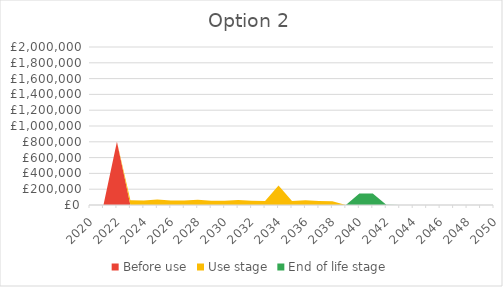
| Category | Before use | Use stage | End of life stage |
|---|---|---|---|
| 2020 | 0 | 0 | 0 |
| 2021 | 0 | 0 | 0 |
| 2022 | 801845.099 | 0 | 0 |
| 2023 | 0 | 59339.58 | 0 |
| 2024 | 0 | 58299.302 | 0 |
| 2025 | 0 | 68673.941 | 0 |
| 2026 | 0 | 56890.675 | 0 |
| 2027 | 0 | 56125.029 | 0 |
| 2028 | 0 | 66002.998 | 0 |
| 2029 | 0 | 54588.369 | 0 |
| 2030 | 0 | 53818.761 | 0 |
| 2031 | 0 | 63473.653 | 0 |
| 2032 | 0 | 52461.748 | 0 |
| 2033 | 0 | 51688.884 | 0 |
| 2034 | 0 | 247586.879 | 0 |
| 2035 | 0 | 50315.956 | 0 |
| 2036 | 0 | 59266.617 | 0 |
| 2037 | 0 | 49093.346 | 0 |
| 2038 | 0 | 48321.427 | 0 |
| 2039 | 0 | 0 | 0 |
| 2040 | 0 | 0 | 144862.56 |
| 2041 | 0 | 0 | 146512.621 |
| 2042 | 0 | 0 | 3525.227 |
| 2043 | 0 | 0 | 0 |
| 2044 | 0 | 0 | 0 |
| 2045 | 0 | 0 | 0 |
| 2046 | 0 | 0 | 0 |
| 2047 | 0 | 0 | 0 |
| 2048 | 0 | 0 | 0 |
| 2049 | 0 | 0 | 0 |
| 2050 | 0 | 0 | 0 |